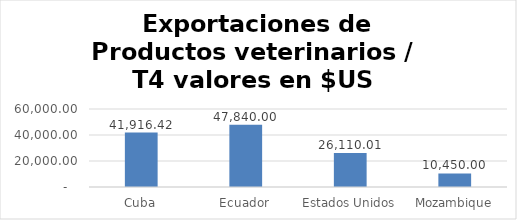
| Category | Cuba |
|---|---|
| Cuba | 41916.42 |
| Ecuador | 47840 |
| Estados Unidos | 26110.01 |
| Mozambique | 10450 |